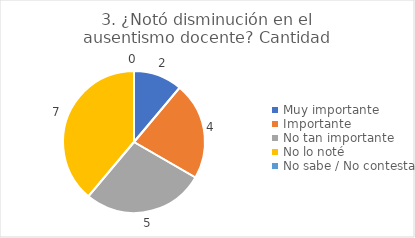
| Category | 3. ¿Notó disminución en el ausentismo docente? |
|---|---|
| Muy importante  | 0.111 |
| Importante  | 0.222 |
| No tan importante  | 0.278 |
| No lo noté  | 0.389 |
| No sabe / No contesta | 0 |